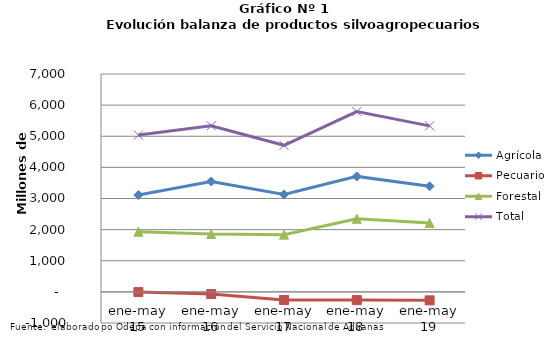
| Category | Agrícola | Pecuario | Forestal | Total |
|---|---|---|---|---|
| ene-may 15 | 3112851 | -6820 | 1930982 | 5037013 |
| ene-may 16 | 3547209 | -68542 | 1858509 | 5337176 |
| ene-may 17 | 3130159 | -259752 | 1838353 | 4708760 |
| ene-may 18 | 3710198 | -264570 | 2347472 | 5793100 |
| ene-may 19 | 3392812 | -272441 | 2213743 | 5334114 |